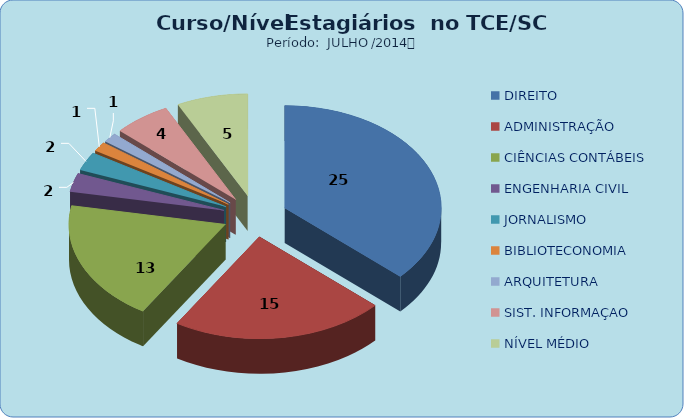
| Category | Series 0 |
|---|---|
| DIREITO | 25 |
| ADMINISTRAÇÃO | 15 |
| CIÊNCIAS CONTÁBEIS | 13 |
| ENGENHARIA CIVIL | 2 |
| JORNALISMO | 2 |
| BIBLIOTECONOMIA | 1 |
| ARQUITETURA | 1 |
| SIST. INFORMAÇAO | 4 |
| NÍVEL MÉDIO | 5 |